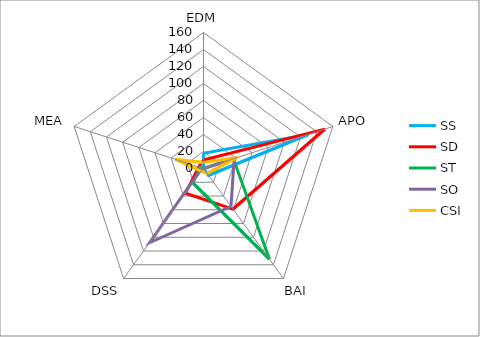
| Category | SS | SD | ST | SO | CSI |
|---|---|---|---|---|---|
| EDM | 18 | 10 | 0 | 0 | 7 |
| APO | 130 | 150 | 37 | 38 | 42 |
| BAI | 10 | 59 | 132 | 55 | 7 |
| DSS | 0 | 36 | 21 | 108 | 4 |
| MEA | 0 | 6 | 4 | 2 | 35 |